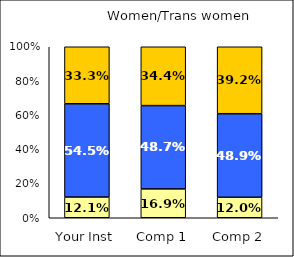
| Category | Low Student-Centered Pedagogy | Average Student-Centered Pedagogy | High Student-Centered Pedagogy |
|---|---|---|---|
| Your Inst | 0.121 | 0.545 | 0.333 |
| Comp 1 | 0.169 | 0.487 | 0.344 |
| Comp 2 | 0.12 | 0.489 | 0.392 |